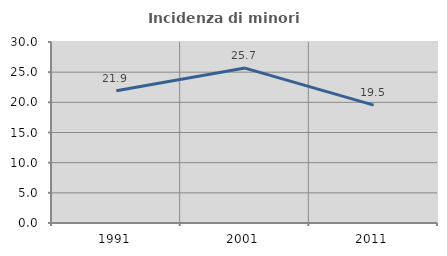
| Category | Incidenza di minori stranieri |
|---|---|
| 1991.0 | 21.918 |
| 2001.0 | 25.676 |
| 2011.0 | 19.544 |